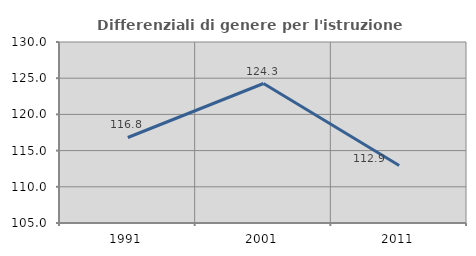
| Category | Differenziali di genere per l'istruzione superiore |
|---|---|
| 1991.0 | 116.81 |
| 2001.0 | 124.266 |
| 2011.0 | 112.93 |